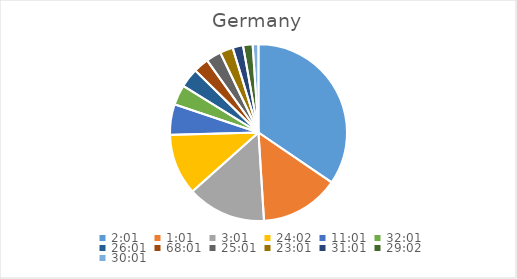
| Category | Series 0 |
|---|---|
| 0.08402777777777777 | 39.085 |
| 0.042361111111111106 | 16.384 |
| 0.12569444444444444 | 16.311 |
| 1.0013888888888889 | 12.637 |
| 0.4590277777777778 | 6.307 |
| 1.3340277777777778 | 4.157 |
| 1.0840277777777778 | 3.982 |
| 2.8340277777777776 | 3.172 |
| 1.042361111111111 | 3.115 |
| 0.9590277777777777 | 2.715 |
| 1.292361111111111 | 2.149 |
| 1.2097222222222224 | 1.98 |
| 1.2506944444444443 | 1.201 |